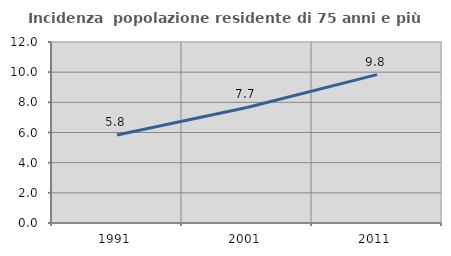
| Category | Incidenza  popolazione residente di 75 anni e più |
|---|---|
| 1991.0 | 5.839 |
| 2001.0 | 7.66 |
| 2011.0 | 9.837 |